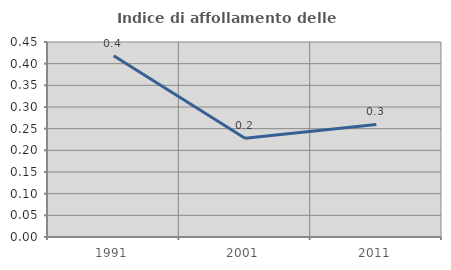
| Category | Indice di affollamento delle abitazioni  |
|---|---|
| 1991.0 | 0.418 |
| 2001.0 | 0.228 |
| 2011.0 | 0.26 |